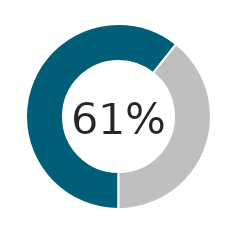
| Category | Series 0 |
|---|---|
| 0 | 0.607 |
| 1 | 0.393 |